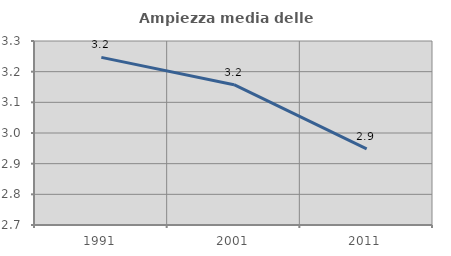
| Category | Ampiezza media delle famiglie |
|---|---|
| 1991.0 | 3.247 |
| 2001.0 | 3.158 |
| 2011.0 | 2.949 |